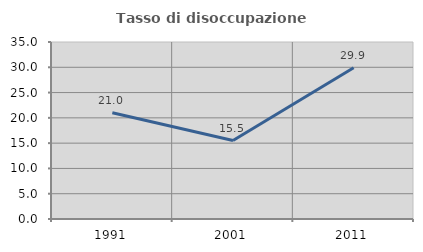
| Category | Tasso di disoccupazione giovanile  |
|---|---|
| 1991.0 | 20.998 |
| 2001.0 | 15.517 |
| 2011.0 | 29.897 |